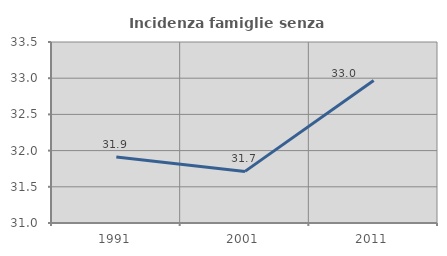
| Category | Incidenza famiglie senza nuclei |
|---|---|
| 1991.0 | 31.913 |
| 2001.0 | 31.713 |
| 2011.0 | 32.969 |